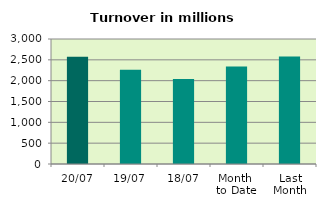
| Category | Series 0 |
|---|---|
| 20/07 | 2571.55 |
| 19/07 | 2263.719 |
| 18/07 | 2042.656 |
| Month 
to Date | 2341.896 |
| Last
Month | 2579.746 |